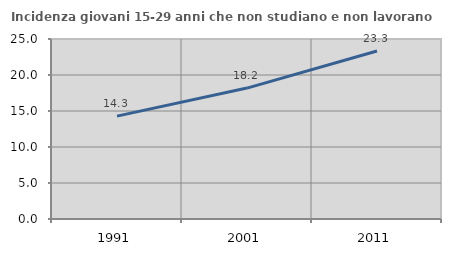
| Category | Incidenza giovani 15-29 anni che non studiano e non lavorano  |
|---|---|
| 1991.0 | 14.286 |
| 2001.0 | 18.182 |
| 2011.0 | 23.333 |